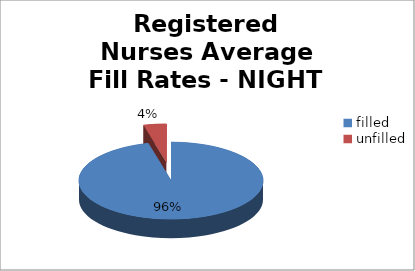
| Category | Series 0 |
|---|---|
| filled  | 96 |
| unfilled | 4 |